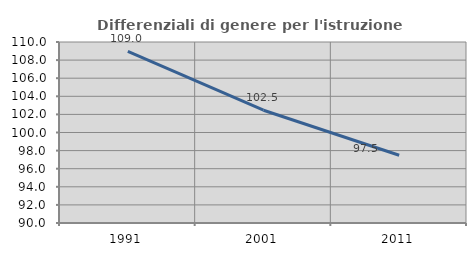
| Category | Differenziali di genere per l'istruzione superiore |
|---|---|
| 1991.0 | 108.961 |
| 2001.0 | 102.463 |
| 2011.0 | 97.485 |